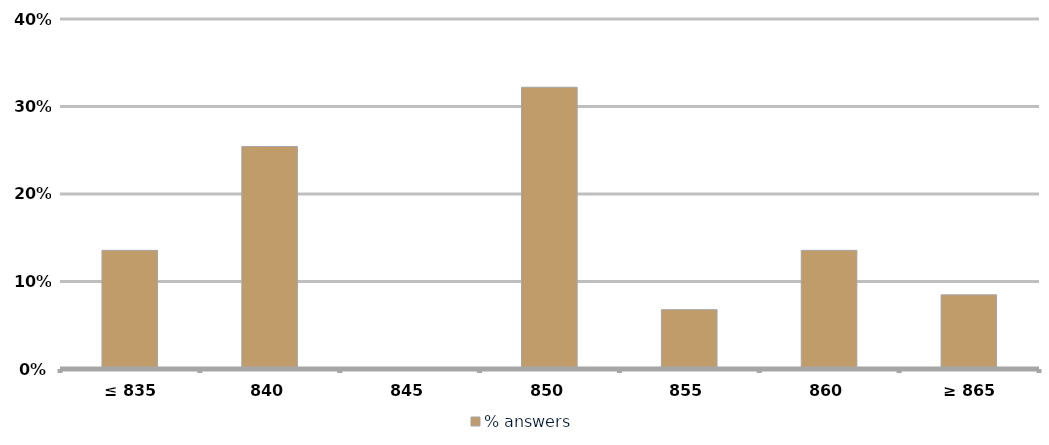
| Category | % answers |
|---|---|
| ≤ 835 | 0.136 |
| 840 | 0.254 |
| 845 | 0 |
| 850 | 0.322 |
| 855 | 0.068 |
| 860 | 0.136 |
| ≥ 865 | 0.085 |